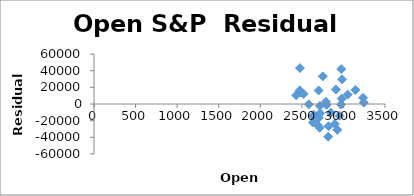
| Category | Series 0 |
|---|---|
| 2431.389893 | 10607.007 |
| 2477.100098 | 13779.357 |
| 2474.419922 | 16348.381 |
| 2521.199951 | 12128.885 |
| 2583.209961 | -398.106 |
| 2645.100098 | -13112.221 |
| 2683.72998 | -24606.766 |
| 2816.449951 | -39325.908 |
| 2715.219971 | -28547.363 |
| 2633.449951 | -22105.952 |
| 2642.959961 | -14713.669 |
| 2718.699951 | -11060.347 |
| 2704.949951 | -16498.325 |
| 2821.169922 | -26669.681 |
| 2896.959961 | -23970.796 |
| 2926.290039 | -31000.437 |
| 2717.580078 | -2303.065 |
| 2790.5 | 2655.692 |
| 2476.959961 | 43094.999 |
| 2702.320068 | 16242.432 |
| 2798.219971 | -1092.197 |
| 2848.629883 | -10453.255 |
| 2952.330078 | -14058.942 |
| 2751.530029 | 33187.394 |
| 2971.409912 | -666.549 |
| 2980.320068 | 6431.679 |
| 2909.01001 | 17462.905 |
| 2983.689941 | 29596.736 |
| 3050.719971 | 11246.184 |
| 3143.850098 | 16772.223 |
| 3244.669922 | 1668.806 |
| 3235.659912 | 7416.521 |
| 2974.280029 | 41944.38 |